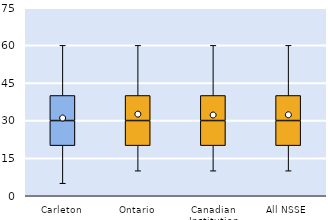
| Category | 25th | 50th | 75th |
|---|---|---|---|
| Carleton | 20 | 10 | 10 |
| Ontario | 20 | 10 | 10 |
| Canadian Institution | 20 | 10 | 10 |
| All NSSE | 20 | 10 | 10 |